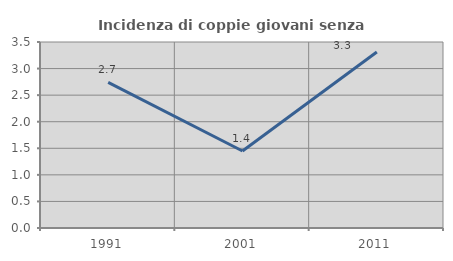
| Category | Incidenza di coppie giovani senza figli |
|---|---|
| 1991.0 | 2.74 |
| 2001.0 | 1.449 |
| 2011.0 | 3.311 |